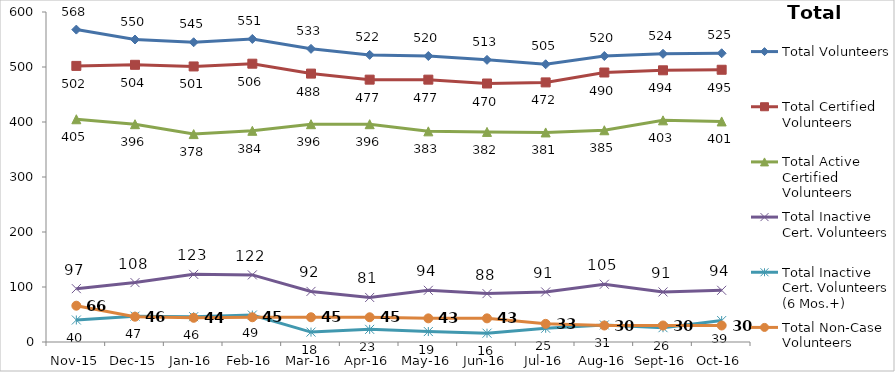
| Category | Total Volunteers | Total Certified Volunteers | Total Active Certified Volunteers | Total Inactive Cert. Volunteers | Total Inactive Cert. Volunteers (6 Mos.+) | Total Non-Case Volunteers |
|---|---|---|---|---|---|---|
| Nov-15 | 568 | 502 | 405 | 97 | 40 | 66 |
| Dec-15 | 550 | 504 | 396 | 108 | 47 | 46 |
| Jan-16 | 545 | 501 | 378 | 123 | 46 | 44 |
| Feb-16 | 551 | 506 | 384 | 122 | 49 | 45 |
| Mar-16 | 533 | 488 | 396 | 92 | 18 | 45 |
| Apr-16 | 522 | 477 | 396 | 81 | 23 | 45 |
| May-16 | 520 | 477 | 383 | 94 | 19 | 43 |
| Jun-16 | 513 | 470 | 382 | 88 | 16 | 43 |
| Jul-16 | 505 | 472 | 381 | 91 | 25 | 33 |
| Aug-16 | 520 | 490 | 385 | 105 | 31 | 30 |
| Sep-16 | 524 | 494 | 403 | 91 | 26 | 30 |
| Oct-16 | 525 | 495 | 401 | 94 | 39 | 30 |